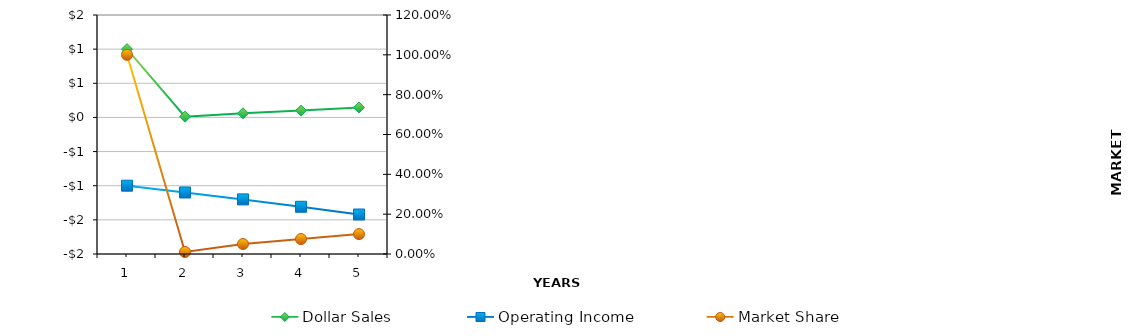
| Category | Dollar Sales | Operating Income |
|---|---|---|
| 0 | 1 | -1 |
| 1 | 0.011 | -1.099 |
| 2 | 0.061 | -1.201 |
| 3 | 0.1 | -1.308 |
| 4 | 0.146 | -1.422 |